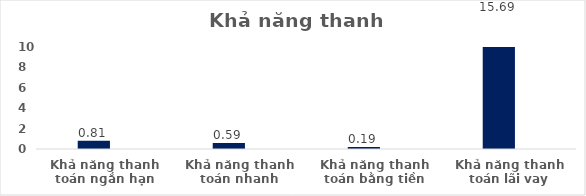
| Category | Series 0 | Series 1 | Series 2 | Series 3 | Series 4 | Series 5 |
|---|---|---|---|---|---|---|
| Khả năng thanh toán ngắn hạn | 0 | 0.813 |  |  |  |  |
| Khả năng thanh toán nhanh | 0 | 0.589 |  |  |  |  |
| Khả năng thanh toán bằng tiền | 0 | 0.188 |  |  |  |  |
| Khả năng thanh toán lãi vay | 0 | 15.69 |  |  |  |  |